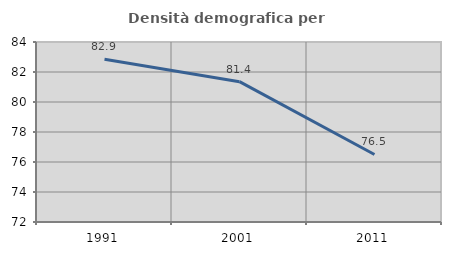
| Category | Densità demografica |
|---|---|
| 1991.0 | 82.854 |
| 2001.0 | 81.356 |
| 2011.0 | 76.503 |